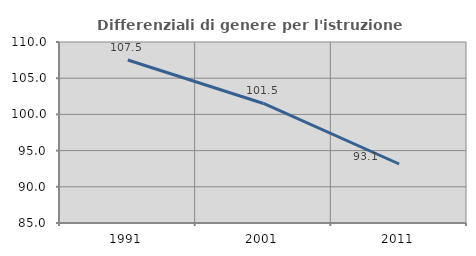
| Category | Differenziali di genere per l'istruzione superiore |
|---|---|
| 1991.0 | 107.516 |
| 2001.0 | 101.509 |
| 2011.0 | 93.15 |